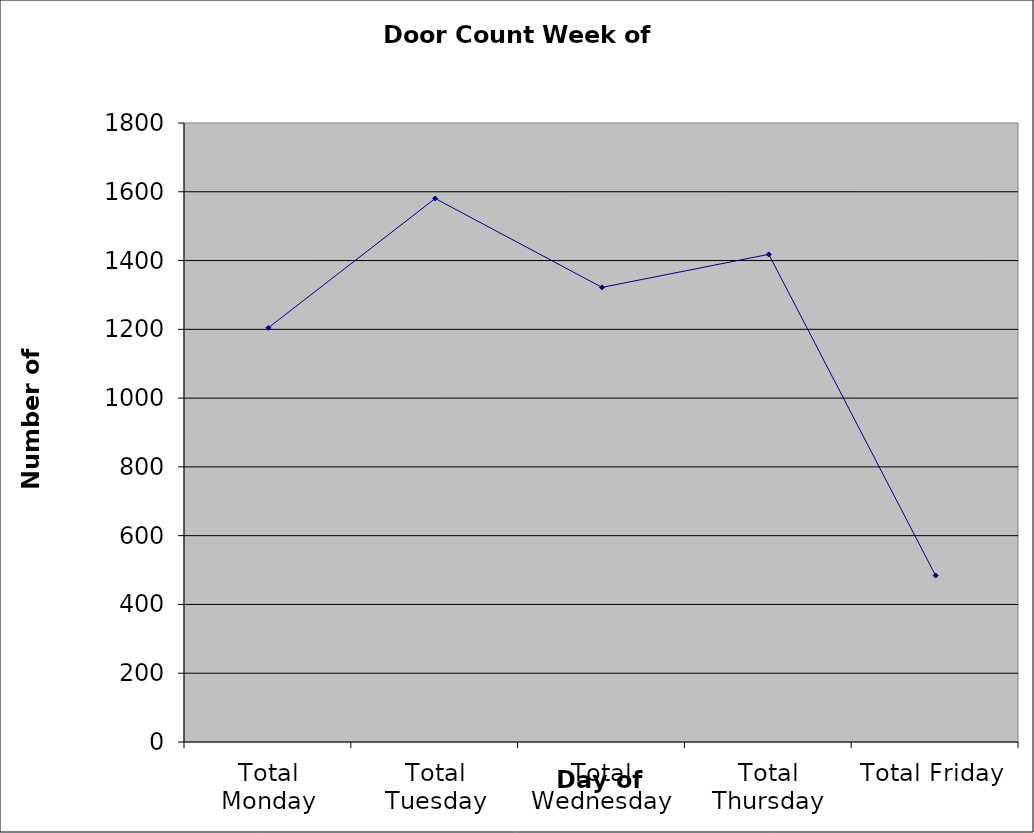
| Category | Series 0 |
|---|---|
| Total Monday | 1204.5 |
| Total Tuesday | 1580.5 |
| Total Wednesday | 1322 |
| Total Thursday | 1418 |
| Total Friday | 484 |